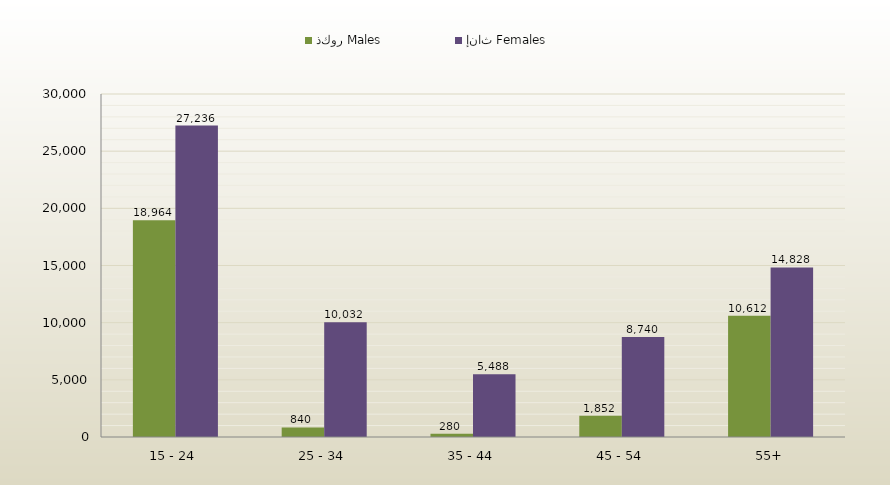
| Category | ذكور Males | إناث Females |
|---|---|---|
| 15 - 24 | 18964 | 27236 |
| 25 - 34 | 840 | 10032 |
| 35 - 44 | 280 | 5488 |
| 45 - 54 | 1852 | 8740 |
| 55+ | 10612 | 14828 |